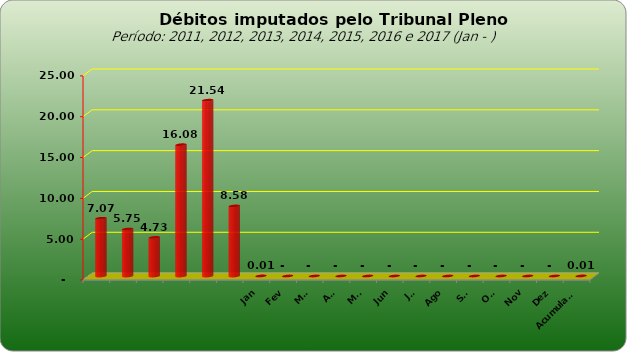
| Category |  7.073.154,74  |
|---|---|
|  | 7073154.74 |
|  | 5749129.25 |
|  | 4727033.51 |
|  | 16081820.48 |
|  | 21535723.6 |
|  | 8578266.09 |
| Jan | 7518 |
| Fev | 0 |
| Mar | 0 |
| Abr | 0 |
| Mai | 0 |
| Jun | 0 |
| Jul | 0 |
| Ago | 0 |
| Set | 0 |
| Out | 0 |
| Nov | 0 |
| Dez | 0 |
| Acumulado | 7518 |